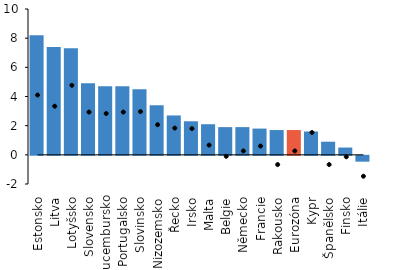
| Category | Nominální růst mezd |
|---|---|
| Estonsko | 8.2 |
| Litva | 7.4 |
| Lotyšsko | 7.3 |
| Slovensko | 4.9 |
| Lucembursko | 4.7 |
| Portugalsko | 4.7 |
| Slovinsko | 4.5 |
| Nizozemsko | 3.4 |
| Řecko | 2.7 |
| Irsko | 2.3 |
| Malta | 2.1 |
| Belgie | 1.9 |
| Německo | 1.9 |
| Francie | 1.8 |
| Rakousko | 1.7 |
| Eurozóna | 1.7 |
| Kypr | 1.6 |
| Španělsko | 0.9 |
| Finsko | 0.5 |
| Itálie | -0.4 |